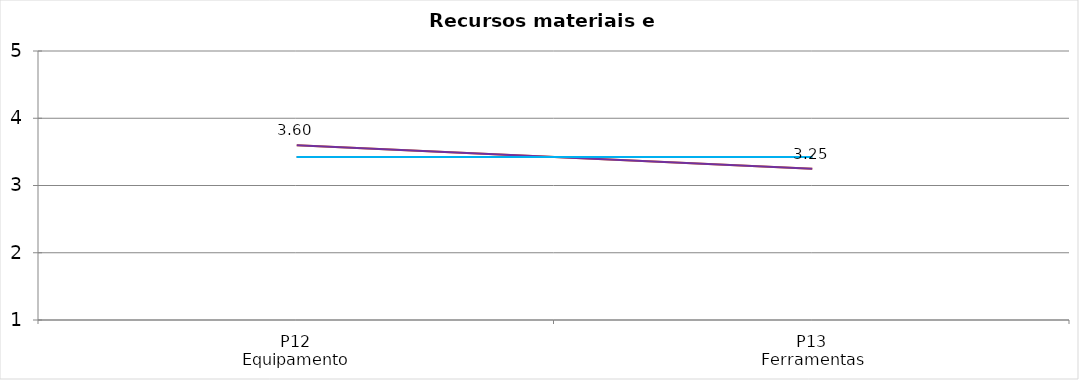
| Category | Valoración (1-5) | MEDIA |
|---|---|---|
| P12
Equipamento | 3.6 | 3.425 |
| P13
Ferramentas | 3.25 | 3.425 |